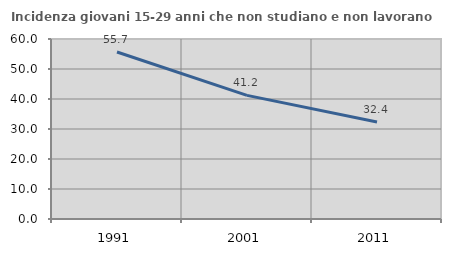
| Category | Incidenza giovani 15-29 anni che non studiano e non lavorano  |
|---|---|
| 1991.0 | 55.679 |
| 2001.0 | 41.199 |
| 2011.0 | 32.353 |